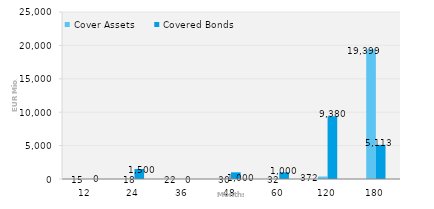
| Category | Cover Assets | Covered Bonds |
|---|---|---|
| 12.0 | 15.326 | 0 |
| 24.0 | 18.183 | 1500 |
| 36.0 | 21.899 | 0 |
| 48.0 | 29.855 | 1000 |
| 60.0 | 31.697 | 1000 |
| 120.0 | 371.847 | 9380 |
| 180.0 | 19399.035 | 5113 |